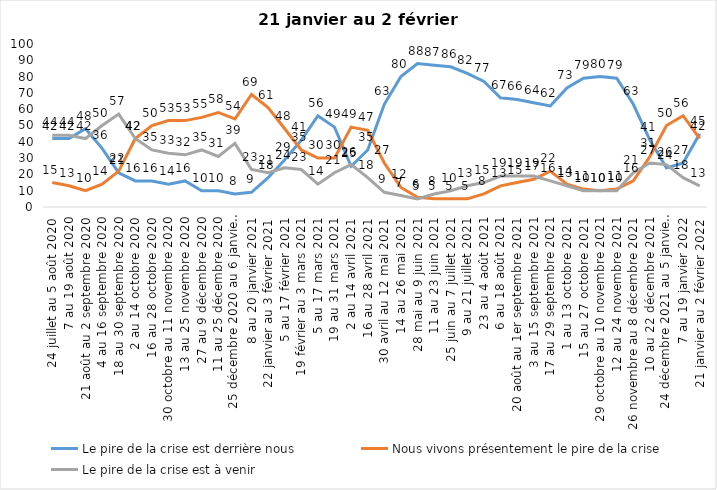
| Category | Le pire de la crise est derrière nous | Nous vivons présentement le pire de la crise | Le pire de la crise est à venir |
|---|---|---|---|
| 24 juillet au 5 août 2020 | 42 | 15 | 44 |
| 7 au 19 août 2020 | 42 | 13 | 44 |
| 21 août au 2 septembre 2020 | 48 | 10 | 42 |
| 4 au 16 septembre 2020 | 36 | 14 | 50 |
| 18 au 30 septembre 2020 | 21 | 22 | 57 |
| 2 au 14 octobre 2020 | 16 | 42 | 42 |
| 16 au 28 octobre 2020 | 16 | 50 | 35 |
| 30 octobre au 11 novembre 2020 | 14 | 53 | 33 |
| 13 au 25 novembre 2020 | 16 | 53 | 32 |
| 27 au 9 décembre 2020 | 10 | 55 | 35 |
| 11 au 25 décembre 2020 | 10 | 58 | 31 |
| 25 décembre 2020 au 6 janvier 2021 | 8 | 54 | 39 |
| 8 au 20 janvier 2021 | 9 | 69 | 23 |
| 22 janvier au 3 février 2021 | 18 | 61 | 21 |
| 5 au 17 février 2021 | 29 | 48 | 24 |
| 19 février au 3 mars 2021 | 41 | 35 | 23 |
| 5 au 17 mars 2021 | 56 | 30 | 14 |
| 19 au 31 mars 2021 | 49 | 30 | 21 |
| 2 au 14 avril 2021 | 25 | 49 | 26 |
| 16 au 28 avril 2021 | 35 | 47 | 18 |
| 30 avril au 12 mai 2021 | 63 | 27 | 9 |
| 14 au 26 mai 2021 | 80 | 12 | 7 |
| 28 mai au 9 juin 2021 | 88 | 6 | 5 |
| 11 au 23 juin 2021 | 87 | 5 | 8 |
| 25 juin au 7 juillet 2021 | 86 | 5 | 10 |
| 9 au 21 juillet 2021 | 82 | 5 | 13 |
| 23 au 4 août 2021 | 77 | 8 | 15 |
| 6 au 18 août 2021 | 67 | 13 | 19 |
| 20 août au 1er septembre 2021 | 66 | 15 | 19 |
| 3 au 15 septembre 2021 | 64 | 17 | 19 |
| 17 au 29 septembre 2021 | 62 | 22 | 16 |
| 1 au 13 octobre 2021 | 73 | 14 | 13 |
| 15 au 27 octobre 2021 | 79 | 11 | 10 |
| 29 octobre au 10 novembre 2021 | 80 | 10 | 10 |
| 12 au 24 novembre 2021 | 79 | 11 | 10 |
| 26 novembre au 8 décembre 2021 | 63 | 16 | 21 |
| 10 au 22 décembre 2021 | 41 | 31 | 27 |
| 24 décembre 2021 au 5 janvier 2022 2022 | 24 | 50 | 26 |
| 7 au 19 janvier 2022 | 27 | 56 | 18 |
| 21 janvier au 2 février 2022 | 45 | 42 | 13 |